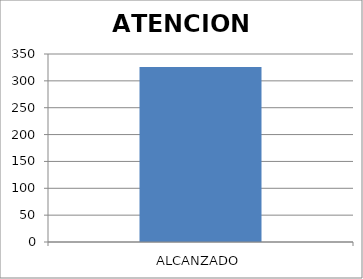
| Category | ATENCION BRINDADA |
|---|---|
| ALCANZADO | 326 |